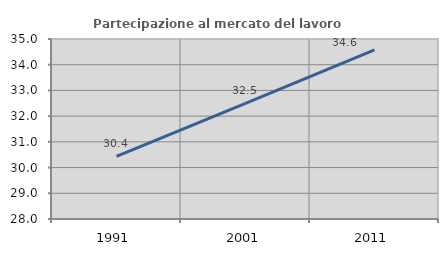
| Category | Partecipazione al mercato del lavoro  femminile |
|---|---|
| 1991.0 | 30.435 |
| 2001.0 | 32.493 |
| 2011.0 | 34.581 |